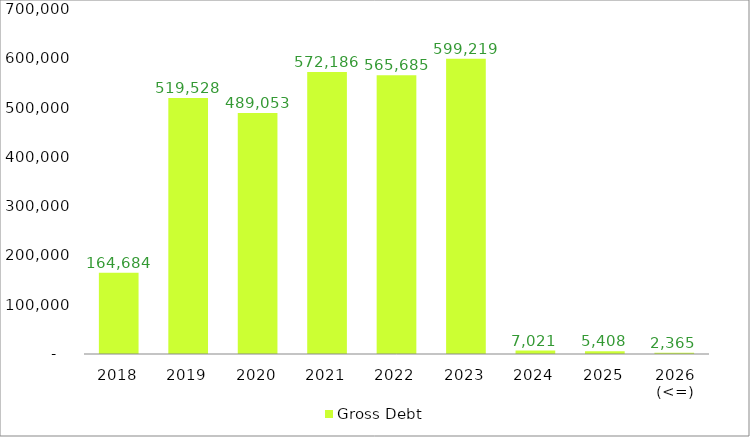
| Category | Gross Debt |
|---|---|
| 2018 | 164683.566 |
| 2019 | 519528.407 |
| 2020 | 489053.105 |
| 2021 | 572185.87 |
| 2022 | 565685.198 |
| 2023 | 599219.482 |
| 2024 | 7021.369 |
| 2025 | 5407.91 |
| 2026 (<=) | 2364.721 |